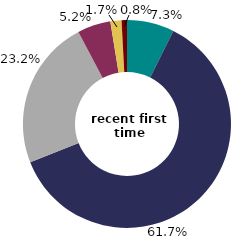
| Category | recent first time buyers  |
|---|---|
| 16-24 | 7.35 |
| 25-34 | 61.674 |
| 35-44 | 23.233 |
| 45-54 | 5.17 |
| 55-64 | 1.737 |
| 65 or over | 0.837 |